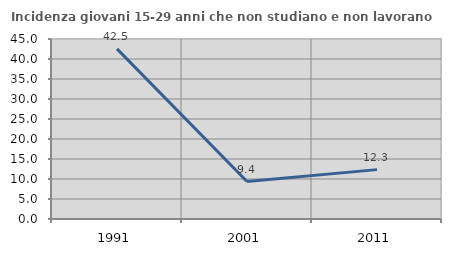
| Category | Incidenza giovani 15-29 anni che non studiano e non lavorano  |
|---|---|
| 1991.0 | 42.543 |
| 2001.0 | 9.365 |
| 2011.0 | 12.344 |